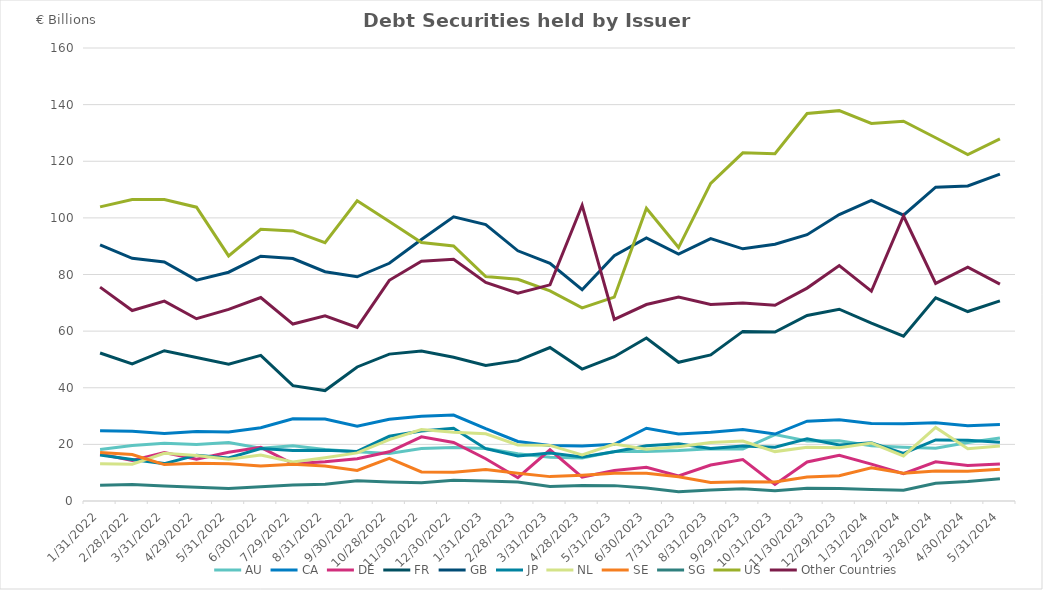
| Category | AU | CA | DE | FR | GB | JP | NL | SE | SG | US | Other Countries |
|---|---|---|---|---|---|---|---|---|---|---|---|
| 1/31/22 | 18.209 | 24.77 | 16.56 | 52.28 | 90.47 | 16.211 | 13.2 | 17.124 | 5.554 | 103.876 | 75.551 |
| 2/28/22 | 19.636 | 24.638 | 14.357 | 48.458 | 85.706 | 14.653 | 13.016 | 16.429 | 5.827 | 106.489 | 67.269 |
| 3/31/22 | 20.436 | 23.839 | 17.113 | 53.081 | 84.395 | 13.205 | 16.839 | 12.868 | 5.311 | 106.45 | 70.583 |
| 4/29/22 | 19.933 | 24.514 | 14.778 | 50.656 | 77.998 | 16.192 | 16.096 | 13.293 | 4.85 | 103.773 | 64.375 |
| 5/31/22 | 20.652 | 24.338 | 17.208 | 48.354 | 80.806 | 15.192 | 14.714 | 13.119 | 4.445 | 86.566 | 67.662 |
| 6/30/22 | 18.61 | 25.868 | 18.938 | 51.448 | 86.443 | 18.526 | 16.257 | 12.352 | 5.066 | 95.959 | 71.852 |
| 7/29/22 | 19.532 | 29.042 | 13.127 | 40.744 | 85.623 | 17.826 | 13.815 | 12.936 | 5.684 | 95.395 | 62.504 |
| 8/31/22 | 18.156 | 28.987 | 13.859 | 39.006 | 80.971 | 17.91 | 15.31 | 12.323 | 5.918 | 91.224 | 65.426 |
| 9/30/22 | 17.425 | 26.424 | 14.923 | 47.346 | 79.199 | 17.516 | 16.99 | 10.763 | 7.112 | 106.025 | 61.343 |
| 10/28/22 | 16.776 | 28.84 | 17.373 | 51.876 | 83.967 | 22.851 | 21.66 | 15.069 | 6.73 | 98.69 | 77.945 |
| 11/30/22 | 18.57 | 29.92 | 22.666 | 52.96 | 92.375 | 24.73 | 25.244 | 10.243 | 6.417 | 91.313 | 84.654 |
| 12/30/22 | 18.926 | 30.336 | 20.699 | 50.76 | 100.348 | 25.693 | 24.296 | 10.143 | 7.356 | 90.057 | 85.362 |
| 1/31/23 | 18.577 | 25.528 | 14.936 | 47.888 | 97.621 | 18.477 | 23.726 | 11.1 | 7.094 | 79.298 | 77.168 |
| 2/28/23 | 16.726 | 21.03 | 8.214 | 49.572 | 88.368 | 15.876 | 19.812 | 9.836 | 6.688 | 78.287 | 73.438 |
| 3/31/23 | 15.452 | 19.622 | 18.07 | 54.211 | 83.96 | 16.953 | 19.647 | 8.611 | 5.095 | 74.195 | 76.351 |
| 4/28/23 | 15.156 | 19.434 | 8.455 | 46.581 | 74.611 | 15.55 | 16.232 | 9.077 | 5.461 | 68.218 | 104.452 |
| 5/31/23 | 17.503 | 20.01 | 10.804 | 50.959 | 86.642 | 17.392 | 20.084 | 9.781 | 5.43 | 71.992 | 64.128 |
| 6/30/23 | 17.474 | 25.687 | 11.898 | 57.568 | 92.919 | 19.503 | 18.31 | 9.787 | 4.565 | 103.409 | 69.389 |
| 7/31/23 | 17.8 | 23.67 | 8.832 | 48.985 | 87.205 | 20.201 | 19.17 | 8.55 | 3.304 | 89.518 | 72.058 |
| 8/31/23 | 18.444 | 24.266 | 12.717 | 51.576 | 92.664 | 18.586 | 20.667 | 6.571 | 3.889 | 112.176 | 69.425 |
| 9/29/23 | 18.338 | 25.283 | 14.639 | 59.903 | 89.072 | 19.388 | 21.162 | 6.809 | 4.286 | 122.971 | 69.898 |
| 10/31/23 | 23.447 | 23.657 | 5.827 | 59.694 | 90.684 | 18.974 | 17.448 | 6.698 | 3.628 | 122.683 | 69.155 |
| 11/30/23 | 21.221 | 28.184 | 13.791 | 65.522 | 94.056 | 21.991 | 18.998 | 8.446 | 4.533 | 136.849 | 75.198 |
| 12/29/23 | 21.247 | 28.662 | 16.13 | 67.732 | 101.157 | 19.781 | 18.848 | 8.924 | 4.453 | 137.875 | 83.161 |
| 1/31/24 | 19.511 | 27.34 | 13.023 | 62.796 | 106.197 | 20.565 | 20.47 | 11.732 | 4.061 | 133.355 | 74.095 |
| 2/29/24 | 19 | 27.281 | 9.688 | 58.213 | 100.977 | 16.802 | 15.912 | 9.778 | 3.803 | 134.16 | 100.664 |
| 3/28/24 | 18.622 | 27.653 | 13.871 | 71.763 | 110.828 | 21.551 | 25.969 | 10.573 | 6.276 | 128.303 | 76.864 |
| 4/30/24 | 20.691 | 26.601 | 12.544 | 66.92 | 111.254 | 21.481 | 18.45 | 10.54 | 6.863 | 122.336 | 82.612 |
| 5/31/24 | 22.268 | 26.997 | 13.07 | 70.689 | 115.424 | 20.779 | 19.417 | 11.171 | 7.885 | 127.892 | 76.614 |